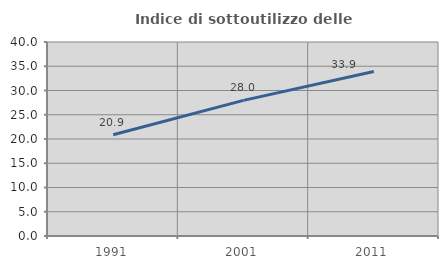
| Category | Indice di sottoutilizzo delle abitazioni  |
|---|---|
| 1991.0 | 20.889 |
| 2001.0 | 27.962 |
| 2011.0 | 33.913 |